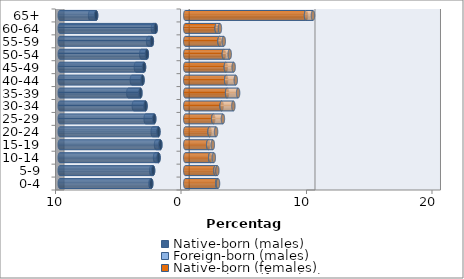
| Category | Native-born (males) | Foreign-born (males) | Native-born (females) | Foreign-born (females) |
|---|---|---|---|---|
| 0-4 | -2.709 | -0.062 | 2.549 | 0.064 |
| 5-9 | -2.562 | -0.148 | 2.407 | 0.152 |
| 10-14 | -2.13 | -0.277 | 1.991 | 0.286 |
| 15-19 | -1.984 | -0.344 | 1.832 | 0.367 |
| 20-24 | -2.137 | -0.457 | 1.938 | 0.518 |
| 25-29 | -2.472 | -0.684 | 2.231 | 0.77 |
| 30-34 | -3.168 | -0.928 | 2.901 | 0.933 |
| 35-39 | -3.573 | -0.965 | 3.334 | 0.878 |
| 40-44 | -3.405 | -0.849 | 3.26 | 0.766 |
| 45-49 | -3.285 | -0.65 | 3.235 | 0.622 |
| 50-54 | -3.059 | -0.445 | 3.078 | 0.466 |
| 55-59 | -2.661 | -0.297 | 2.729 | 0.341 |
| 60-64 | -2.358 | -0.221 | 2.506 | 0.256 |
| 65+ | -7.103 | -0.48 | 9.624 | 0.554 |